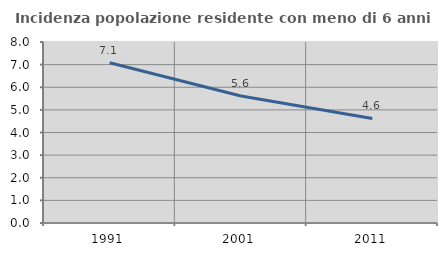
| Category | Incidenza popolazione residente con meno di 6 anni |
|---|---|
| 1991.0 | 7.084 |
| 2001.0 | 5.614 |
| 2011.0 | 4.619 |